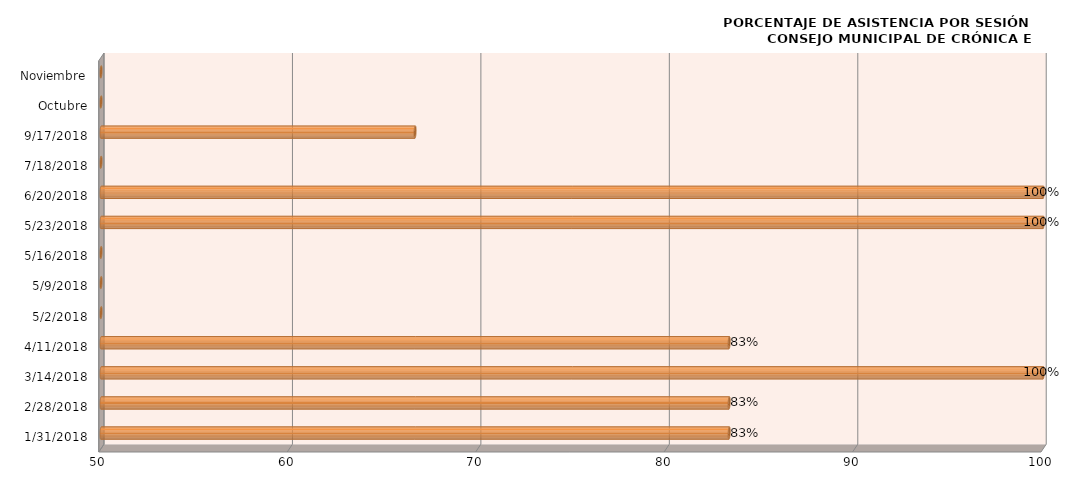
| Category | Series 0 |
|---|---|
| 31/01/2018 | 83.333 |
| 28/02/2018 | 83.333 |
| 14/03/2018 | 100 |
| 11/04/2018 | 83.333 |
| 02/05/2018 | 0 |
| 09/05/2018 | 0 |
| 16/05/2018 | 0 |
| 23/05/2018 | 100 |
| 20/06/2018 | 100 |
| 18/07/2018 | 0 |
| 17/09/2018 | 66.667 |
| Octubre | 0 |
| Noviembre | 0 |